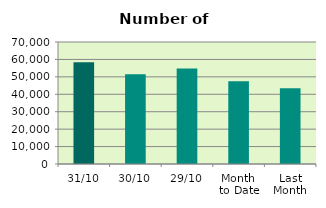
| Category | Series 0 |
|---|---|
| 31/10 | 58438 |
| 30/10 | 51478 |
| 29/10 | 54828 |
| Month 
to Date | 47528 |
| Last
Month | 43452.667 |